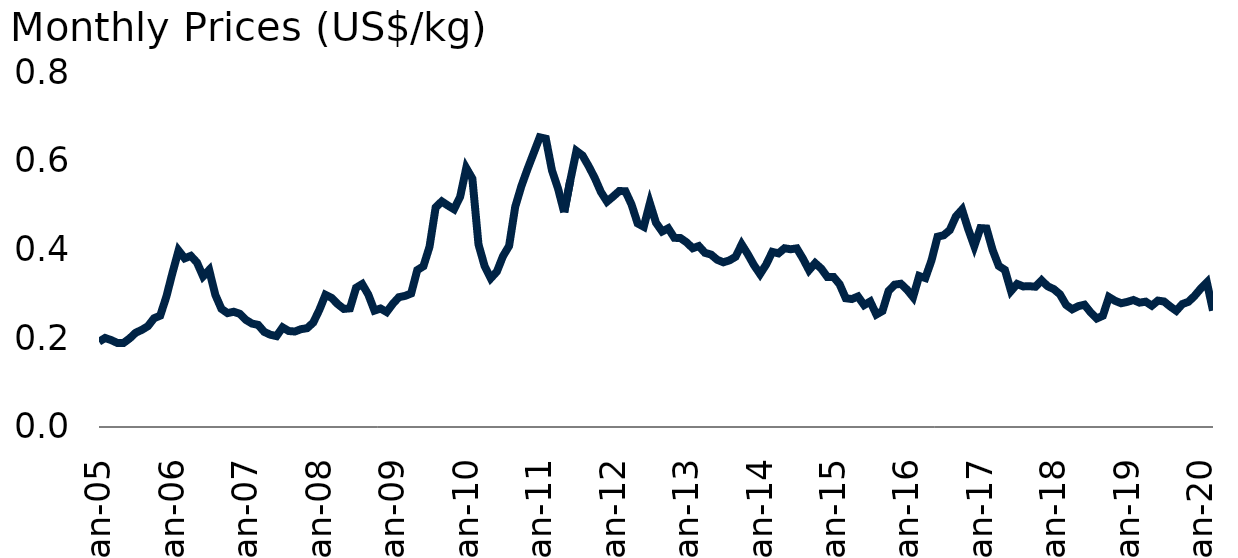
| Category | Sugar |
|---|---|
| 2005-01-01 | 0.192 |
| 2005-02-01 | 0.201 |
| 2005-03-01 | 0.196 |
| 2005-04-01 | 0.189 |
| 2005-05-01 | 0.189 |
| 2005-06-01 | 0.2 |
| 2005-07-01 | 0.213 |
| 2005-08-01 | 0.219 |
| 2005-09-01 | 0.227 |
| 2005-10-01 | 0.245 |
| 2005-11-01 | 0.251 |
| 2005-12-01 | 0.293 |
| 2006-01-01 | 0.347 |
| 2006-02-01 | 0.398 |
| 2006-03-01 | 0.38 |
| 2006-04-01 | 0.386 |
| 2006-05-01 | 0.371 |
| 2006-06-01 | 0.34 |
| 2006-07-01 | 0.354 |
| 2006-08-01 | 0.298 |
| 2006-09-01 | 0.266 |
| 2006-10-01 | 0.257 |
| 2006-11-01 | 0.26 |
| 2006-12-01 | 0.255 |
| 2007-01-01 | 0.241 |
| 2007-02-01 | 0.233 |
| 2007-03-01 | 0.23 |
| 2007-04-01 | 0.214 |
| 2007-05-01 | 0.208 |
| 2007-06-01 | 0.205 |
| 2007-07-01 | 0.224 |
| 2007-08-01 | 0.216 |
| 2007-09-01 | 0.215 |
| 2007-10-01 | 0.22 |
| 2007-11-01 | 0.223 |
| 2007-12-01 | 0.235 |
| 2008-01-01 | 0.264 |
| 2008-02-01 | 0.298 |
| 2008-03-01 | 0.291 |
| 2008-04-01 | 0.277 |
| 2008-05-01 | 0.266 |
| 2008-06-01 | 0.267 |
| 2008-07-01 | 0.314 |
| 2008-08-01 | 0.322 |
| 2008-09-01 | 0.298 |
| 2008-10-01 | 0.262 |
| 2008-11-01 | 0.267 |
| 2008-12-01 | 0.259 |
| 2009-01-01 | 0.278 |
| 2009-02-01 | 0.293 |
| 2009-03-01 | 0.295 |
| 2009-04-01 | 0.301 |
| 2009-05-01 | 0.354 |
| 2009-06-01 | 0.362 |
| 2009-07-01 | 0.406 |
| 2009-08-01 | 0.495 |
| 2009-09-01 | 0.508 |
| 2009-10-01 | 0.499 |
| 2009-11-01 | 0.491 |
| 2009-12-01 | 0.519 |
| 2010-01-01 | 0.584 |
| 2010-02-01 | 0.56 |
| 2010-03-01 | 0.411 |
| 2010-04-01 | 0.363 |
| 2010-05-01 | 0.335 |
| 2010-06-01 | 0.35 |
| 2010-07-01 | 0.385 |
| 2010-08-01 | 0.408 |
| 2010-09-01 | 0.496 |
| 2010-10-01 | 0.543 |
| 2010-11-01 | 0.581 |
| 2010-12-01 | 0.617 |
| 2011-01-01 | 0.653 |
| 2011-02-01 | 0.65 |
| 2011-03-01 | 0.578 |
| 2011-04-01 | 0.537 |
| 2011-05-01 | 0.484 |
| 2011-06-01 | 0.556 |
| 2011-07-01 | 0.622 |
| 2011-08-01 | 0.612 |
| 2011-09-01 | 0.588 |
| 2011-10-01 | 0.561 |
| 2011-11-01 | 0.53 |
| 2011-12-01 | 0.508 |
| 2012-01-01 | 0.519 |
| 2012-02-01 | 0.532 |
| 2012-03-01 | 0.531 |
| 2012-04-01 | 0.502 |
| 2012-05-01 | 0.459 |
| 2012-06-01 | 0.451 |
| 2012-07-01 | 0.504 |
| 2012-08-01 | 0.46 |
| 2012-09-01 | 0.441 |
| 2012-10-01 | 0.448 |
| 2012-11-01 | 0.426 |
| 2012-12-01 | 0.426 |
| 2013-01-01 | 0.416 |
| 2013-02-01 | 0.403 |
| 2013-03-01 | 0.408 |
| 2013-04-01 | 0.393 |
| 2013-05-01 | 0.389 |
| 2013-06-01 | 0.377 |
| 2013-07-01 | 0.371 |
| 2013-08-01 | 0.375 |
| 2013-09-01 | 0.384 |
| 2013-10-01 | 0.411 |
| 2013-11-01 | 0.389 |
| 2013-12-01 | 0.365 |
| 2014-01-01 | 0.345 |
| 2014-02-01 | 0.366 |
| 2014-03-01 | 0.395 |
| 2014-04-01 | 0.391 |
| 2014-05-01 | 0.403 |
| 2014-06-01 | 0.401 |
| 2014-07-01 | 0.403 |
| 2014-08-01 | 0.38 |
| 2014-09-01 | 0.353 |
| 2014-10-01 | 0.369 |
| 2014-11-01 | 0.357 |
| 2014-12-01 | 0.338 |
| 2015-01-01 | 0.338 |
| 2015-02-01 | 0.322 |
| 2015-03-01 | 0.29 |
| 2015-04-01 | 0.288 |
| 2015-05-01 | 0.294 |
| 2015-06-01 | 0.275 |
| 2015-07-01 | 0.283 |
| 2015-08-01 | 0.254 |
| 2015-09-01 | 0.261 |
| 2015-10-01 | 0.307 |
| 2015-11-01 | 0.321 |
| 2015-12-01 | 0.323 |
| 2016-01-01 | 0.31 |
| 2016-02-01 | 0.293 |
| 2016-03-01 | 0.34 |
| 2016-04-01 | 0.336 |
| 2016-05-01 | 0.375 |
| 2016-06-01 | 0.429 |
| 2016-07-01 | 0.432 |
| 2016-08-01 | 0.444 |
| 2016-09-01 | 0.475 |
| 2016-10-01 | 0.49 |
| 2016-11-01 | 0.446 |
| 2016-12-01 | 0.408 |
| 2017-01-01 | 0.448 |
| 2017-02-01 | 0.447 |
| 2017-03-01 | 0.399 |
| 2017-04-01 | 0.363 |
| 2017-05-01 | 0.354 |
| 2017-06-01 | 0.306 |
| 2017-07-01 | 0.322 |
| 2017-08-01 | 0.317 |
| 2017-09-01 | 0.317 |
| 2017-10-01 | 0.316 |
| 2017-11-01 | 0.33 |
| 2017-12-01 | 0.317 |
| 2018-01-01 | 0.311 |
| 2018-02-01 | 0.299 |
| 2018-03-01 | 0.275 |
| 2018-04-01 | 0.265 |
| 2018-05-01 | 0.272 |
| 2018-06-01 | 0.276 |
| 2018-07-01 | 0.258 |
| 2018-08-01 | 0.244 |
| 2018-09-01 | 0.251 |
| 2018-10-01 | 0.293 |
| 2018-11-01 | 0.284 |
| 2018-12-01 | 0.279 |
| 2019-01-01 | 0.282 |
| 2019-02-01 | 0.286 |
| 2019-03-01 | 0.28 |
| 2019-04-01 | 0.282 |
| 2019-05-01 | 0.273 |
| 2019-06-01 | 0.285 |
| 2019-07-01 | 0.283 |
| 2019-08-01 | 0.272 |
| 2019-09-01 | 0.262 |
| 2019-10-01 | 0.277 |
| 2019-11-01 | 0.282 |
| 2019-12-01 | 0.296 |
| 2020-01-01 | 0.312 |
| 2020-02-01 | 0.326 |
| 2020-03-01 | 0.262 |